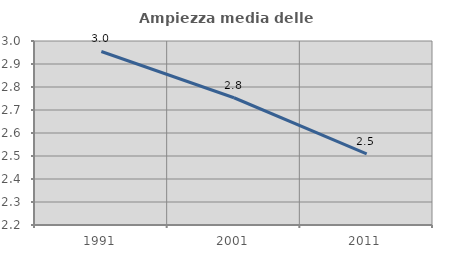
| Category | Ampiezza media delle famiglie |
|---|---|
| 1991.0 | 2.954 |
| 2001.0 | 2.753 |
| 2011.0 | 2.51 |